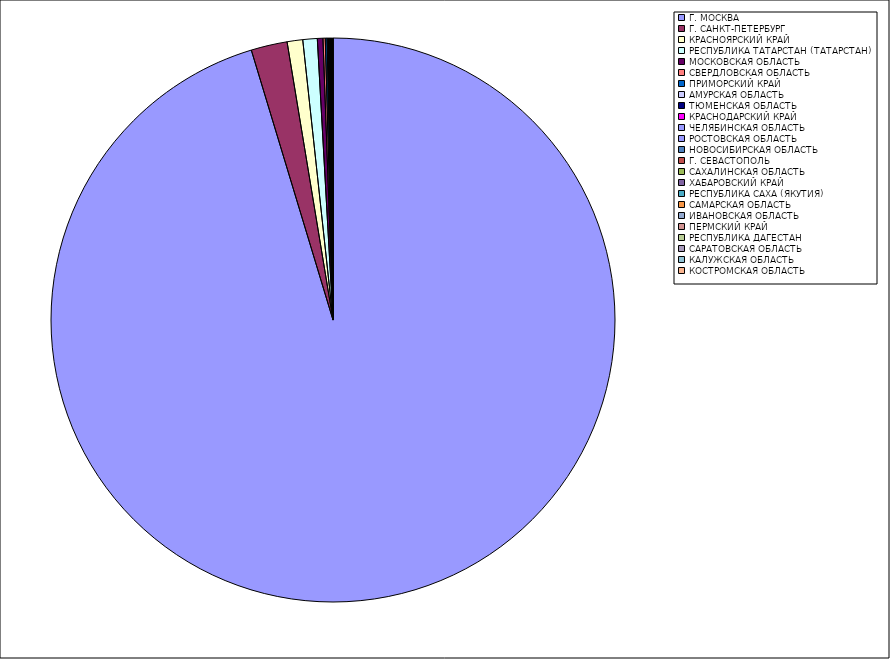
| Category | Оборот |
|---|---|
| Г. МОСКВА | 95.281 |
| Г. САНКТ-ПЕТЕРБУРГ | 2.072 |
| КРАСНОЯРСКИЙ КРАЙ | 0.892 |
| РЕСПУБЛИКА ТАТАРСТАН (ТАТАРСТАН) | 0.825 |
| МОСКОВСКАЯ ОБЛАСТЬ | 0.32 |
| СВЕРДЛОВСКАЯ ОБЛАСТЬ | 0.13 |
| ПРИМОРСКИЙ КРАЙ | 0.099 |
| АМУРСКАЯ ОБЛАСТЬ | 0.047 |
| ТЮМЕНСКАЯ ОБЛАСТЬ | 0.037 |
| КРАСНОДАРСКИЙ КРАЙ | 0.035 |
| ЧЕЛЯБИНСКАЯ ОБЛАСТЬ | 0.032 |
| РОСТОВСКАЯ ОБЛАСТЬ | 0.029 |
| НОВОСИБИРСКАЯ ОБЛАСТЬ | 0.021 |
| Г. СЕВАСТОПОЛЬ | 0.019 |
| САХАЛИНСКАЯ ОБЛАСТЬ | 0.019 |
| ХАБАРОВСКИЙ КРАЙ | 0.019 |
| РЕСПУБЛИКА САХА (ЯКУТИЯ) | 0.016 |
| САМАРСКАЯ ОБЛАСТЬ | 0.013 |
| ИВАНОВСКАЯ ОБЛАСТЬ | 0.013 |
| ПЕРМСКИЙ КРАЙ | 0.01 |
| РЕСПУБЛИКА ДАГЕСТАН | 0.008 |
| САРАТОВСКАЯ ОБЛАСТЬ | 0.008 |
| КАЛУЖСКАЯ ОБЛАСТЬ | 0.006 |
| КОСТРОМСКАЯ ОБЛАСТЬ | 0.006 |